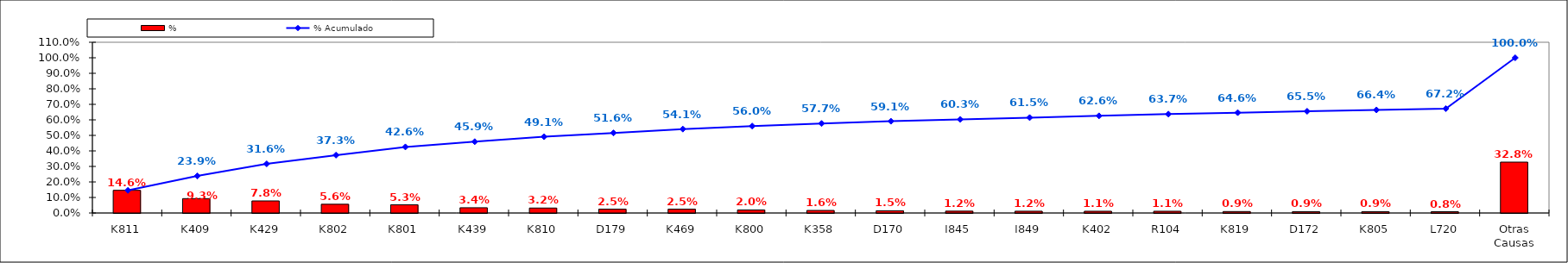
| Category | % |
|---|---|
| K811 | 0.146 |
| K409 | 0.093 |
| K429 | 0.078 |
| K802 | 0.056 |
| K801 | 0.053 |
| K439 | 0.034 |
| K810 | 0.032 |
| D179 | 0.025 |
| K469 | 0.025 |
| K800 | 0.02 |
| K358 | 0.016 |
| D170 | 0.015 |
| I845 | 0.012 |
| I849 | 0.012 |
| K402 | 0.011 |
| R104 | 0.011 |
| K819 | 0.009 |
| D172 | 0.009 |
| K805 | 0.009 |
| L720 | 0.008 |
| Otras Causas | 0.328 |